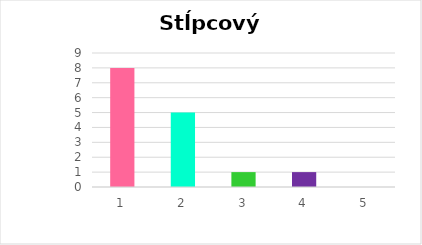
| Category | počet ž. |
|---|---|
| 0 | 8 |
| 1 | 5 |
| 2 | 1 |
| 3 | 1 |
| 4 | 0 |